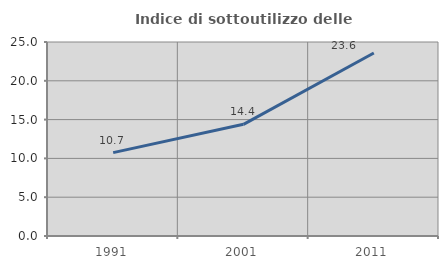
| Category | Indice di sottoutilizzo delle abitazioni  |
|---|---|
| 1991.0 | 10.741 |
| 2001.0 | 14.393 |
| 2011.0 | 23.59 |